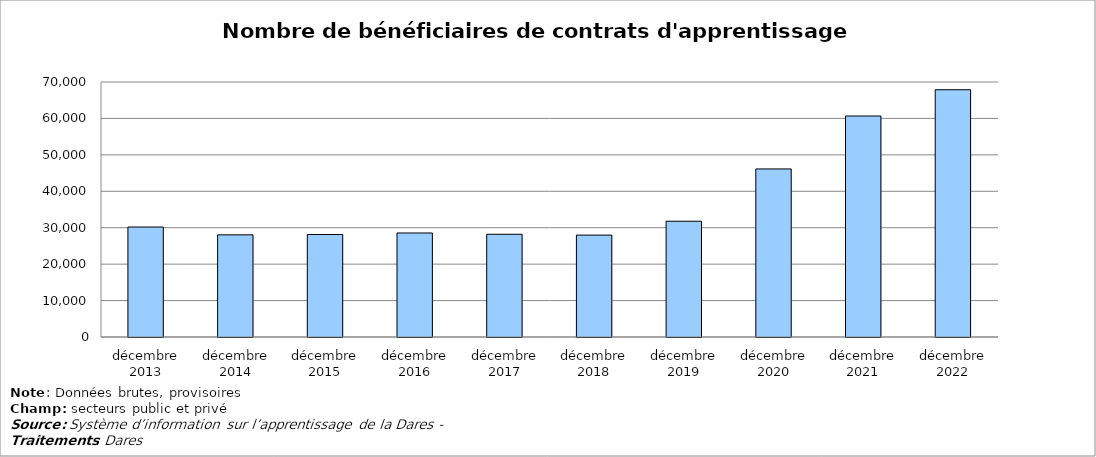
| Category | Series 0 |
|---|---|
| décembre 2013 | 30191 |
| décembre 2014 | 28047 |
| décembre 2015 | 28135 |
| décembre 2016 | 28553 |
| décembre 2017 | 28198 |
| décembre 2018 | 27973 |
| décembre 2019 | 31782 |
| décembre 2020 | 46131 |
| décembre 2021 | 60668 |
| décembre 2022 | 67881 |